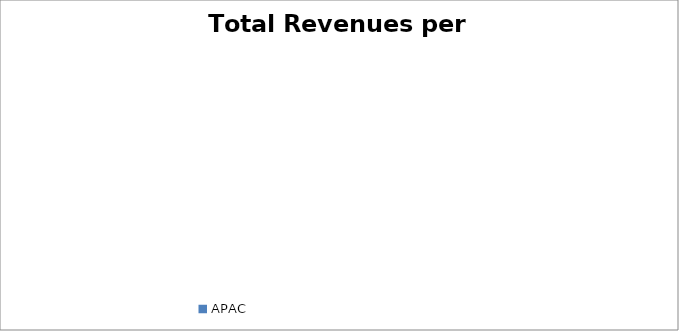
| Category | Total Revenues |
|---|---|
| APAC | 2581897.314 |
| Europe | 4186826.084 |
| LATAM | 5012617.263 |
| MEA | 3740980.647 |
| North America | 1346430.36 |